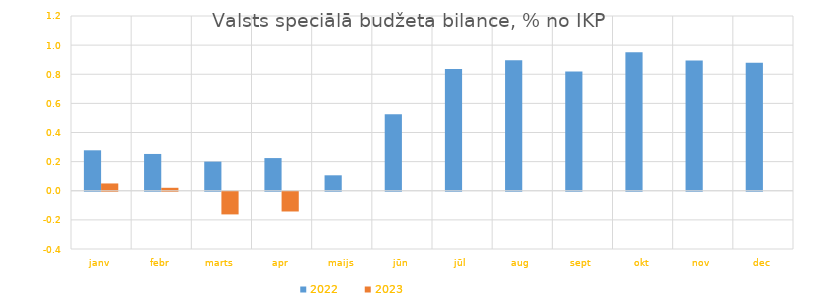
| Category | 2022 | 2023 |
|---|---|---|
| janv | 0.278 | 0.05 |
| febr | 0.253 | 0.02 |
| marts | 0.2 | -0.156 |
| apr | 0.224 | -0.136 |
| maijs | 0.106 | 0 |
| jūn | 0.525 | 0 |
| jūl | 0.836 | 0 |
| aug | 0.897 | 0 |
| sept | 0.819 | 0 |
| okt | 0.952 | 0 |
| nov | 0.894 | 0 |
| dec | 0.879 | 0 |